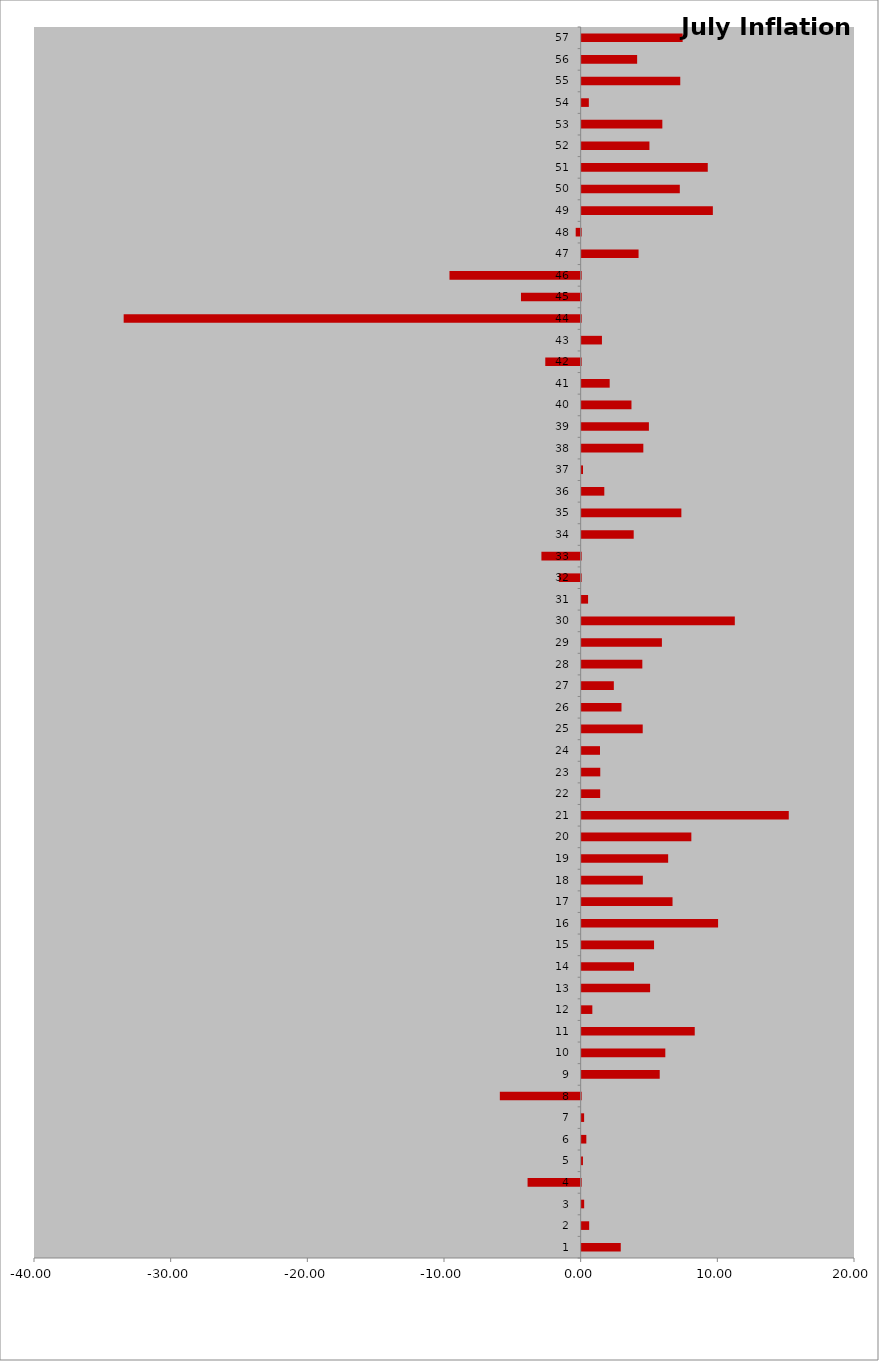
| Category | July Inflation Rate |
|---|---|
| 0 | 2.86 |
| 1 | 0.549 |
| 2 | 0.183 |
| 3 | -3.885 |
| 4 | 0.093 |
| 5 | 0.342 |
| 6 | 0.18 |
| 7 | -5.915 |
| 8 | 5.712 |
| 9 | 6.121 |
| 10 | 8.274 |
| 11 | 0.781 |
| 12 | 5.009 |
| 13 | 3.83 |
| 14 | 5.296 |
| 15 | 9.982 |
| 16 | 6.649 |
| 17 | 4.476 |
| 18 | 6.328 |
| 19 | 8.025 |
| 20 | 15.154 |
| 21 | 1.355 |
| 22 | 1.361 |
| 23 | 1.341 |
| 24 | 4.467 |
| 25 | 2.914 |
| 26 | 2.354 |
| 27 | 4.439 |
| 28 | 5.871 |
| 29 | 11.206 |
| 30 | 0.469 |
| 31 | -1.595 |
| 32 | -2.873 |
| 33 | 3.808 |
| 34 | 7.295 |
| 35 | 1.657 |
| 36 | 0.096 |
| 37 | 4.512 |
| 38 | 4.92 |
| 39 | 3.644 |
| 40 | 2.05 |
| 41 | -2.59 |
| 42 | 1.484 |
| 43 | -33.439 |
| 44 | -4.367 |
| 45 | -9.599 |
| 46 | 4.163 |
| 47 | -0.364 |
| 48 | 9.599 |
| 49 | 7.181 |
| 50 | 9.227 |
| 51 | 4.959 |
| 52 | 5.903 |
| 53 | 0.525 |
| 54 | 7.214 |
| 55 | 4.059 |
| 56 | 7.388 |